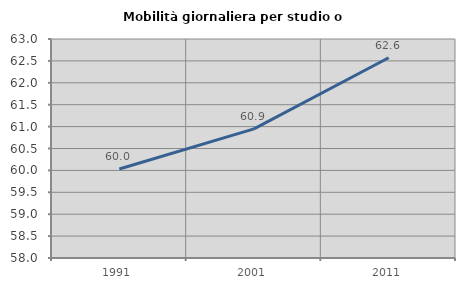
| Category | Mobilità giornaliera per studio o lavoro |
|---|---|
| 1991.0 | 60.033 |
| 2001.0 | 60.948 |
| 2011.0 | 62.573 |